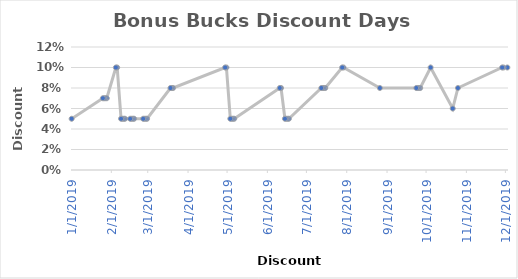
| Category | Discount |
|---|---|
| 12/2/19 | 0.1 |
| 11/29/19 | 0.1 |
| 11/28/19 | 0.1 |
| 10/25/19 | 0.08 |
| 10/21/19 | 0.06 |
| 10/4/19 | 0.1 |
| 9/26/19 | 0.08 |
| 9/25/19 | 0.08 |
| 9/24/19 | 0.08 |
| 9/23/19 | 0.08 |
| 8/26/19 | 0.08 |
| 7/29/19 | 0.1 |
| 7/28/19 | 0.1 |
| 7/15/19 | 0.08 |
| 7/14/19 | 0.08 |
| 7/13/19 | 0.08 |
| 7/12/19 | 0.08 |
| 6/17/19 | 0.05 |
| 6/16/19 | 0.05 |
| 6/15/19 | 0.05 |
| 6/14/19 | 0.05 |
| 6/11/19 | 0.08 |
| 6/10/19 | 0.08 |
| 5/6/19 | 0.05 |
| 5/5/19 | 0.05 |
| 5/4/19 | 0.05 |
| 5/3/19 | 0.05 |
| 4/30/19 | 0.1 |
| 4/29/19 | 0.1 |
| 3/20/19 | 0.08 |
| 3/19/19 | 0.08 |
| 3/18/19 | 0.08 |
| 2/28/19 | 0.05 |
| 2/27/19 | 0.05 |
| 2/26/19 | 0.05 |
| 2/25/19 | 0.05 |
| 2/18/19 | 0.05 |
| 2/17/19 | 0.05 |
| 2/16/19 | 0.05 |
| 2/15/19 | 0.05 |
| 2/11/19 | 0.05 |
| 2/10/19 | 0.05 |
| 2/9/19 | 0.05 |
| 2/8/19 | 0.05 |
| 2/5/19 | 0.1 |
| 2/4/19 | 0.1 |
| 1/28/19 | 0.07 |
| 1/27/19 | 0.07 |
| 1/26/19 | 0.07 |
| 1/25/19 | 0.07 |
| 1/1/19 | 0.05 |